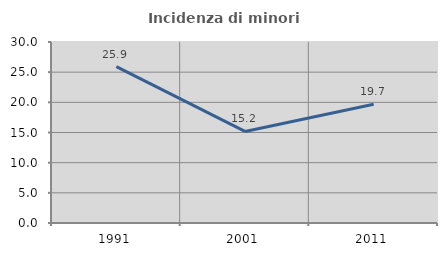
| Category | Incidenza di minori stranieri |
|---|---|
| 1991.0 | 25.926 |
| 2001.0 | 15.172 |
| 2011.0 | 19.681 |